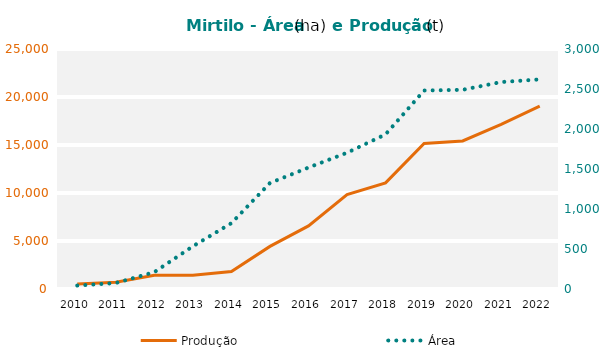
| Category | Produção  |
|---|---|
| 2010 | 530 |
| 2011 | 700 |
| 2012 | 1437 |
| 2013 | 1429 |
| 2014 | 1824 |
| 2015 | 4436 |
| 2016 | 6572 |
| 2017 | 9840 |
| 2018 | 11061 |
| 2019 | 15160 |
| 2020 | 15418 |
| 2021 | 17144 |
| 2022 | 19051 |